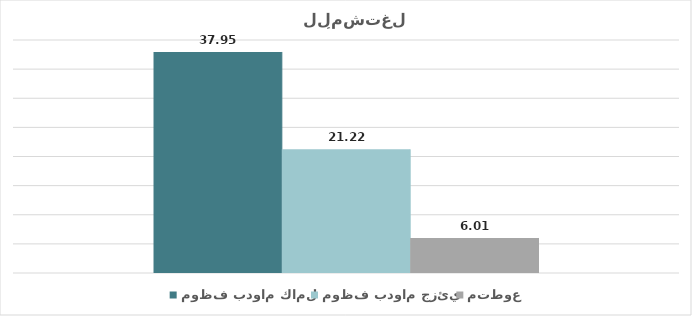
| Category | موظف بدوام كامل | موظف بدوام جزئي | متطوع |
|---|---|---|---|
| الحالة الوظيفية | 37.947 | 21.223 | 6.01 |